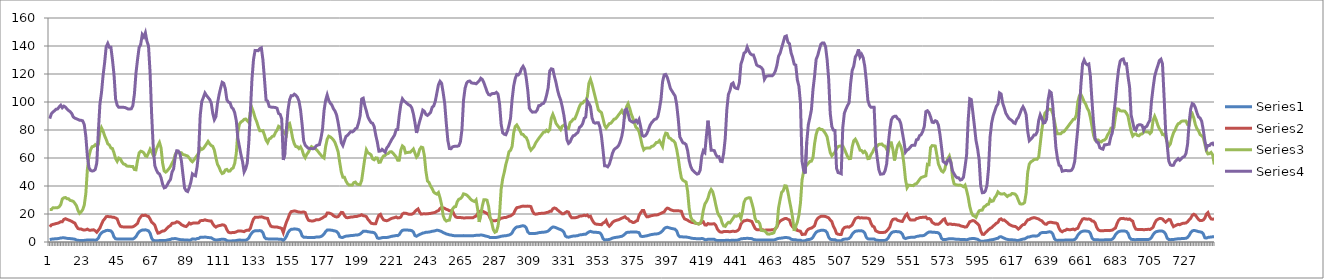
| Category | Series 0 | Series 1 | Series 2 | Series 3 |
|---|---|---|---|---|
| 0 | 1.62 | 10.87 | 23.15 | 88.1 |
| 1 | 2.01 | 12.18 | 23.14 | 91.56 |
| 2 | 2.13 | 12.58 | 24.39 | 92.85 |
| 3 | 2.24 | 12.83 | 24.37 | 93.68 |
| 4 | 2.37 | 13.2 | 24.41 | 94.81 |
| 5 | 2.41 | 13.39 | 24.51 | 95.03 |
| 6 | 2.59 | 13.84 | 25.14 | 96.51 |
| 7 | 2.88 | 14.51 | 26.75 | 97.7 |
| 8 | 2.96 | 14.46 | 30.78 | 95.88 |
| 9 | 3.01 | 16.14 | 31.55 | 97.03 |
| 10 | 2.82 | 16.63 | 31.79 | 96.36 |
| 11 | 2.6 | 16.16 | 30.94 | 94.97 |
| 12 | 2.51 | 15.7 | 30.88 | 93.92 |
| 13 | 2.42 | 15.26 | 29.72 | 93.07 |
| 14 | 2.32 | 14.76 | 29.45 | 91.81 |
| 15 | 2.17 | 14.03 | 29.03 | 89.3 |
| 16 | 2.01 | 13.48 | 27.63 | 88.48 |
| 17 | 1.4 | 11.31 | 25.93 | 88 |
| 18 | 1.2 | 9.6 | 22.55 | 87.52 |
| 19 | 1.12 | 9.28 | 20.48 | 86.98 |
| 20 | 1.12 | 9.26 | 21.52 | 86.93 |
| 21 | 1.12 | 8.74 | 23.09 | 86.53 |
| 22 | 1.15 | 8.52 | 26.3 | 83.9 |
| 23 | 1.26 | 8.72 | 34.6 | 75.58 |
| 24 | 1.45 | 9.19 | 51.88 | 61.16 |
| 25 | 1.38 | 8.49 | 61.28 | 53.19 |
| 26 | 1.37 | 8.37 | 65.73 | 51.13 |
| 27 | 1.4 | 8.63 | 68.06 | 50.7 |
| 28 | 1.39 | 8.69 | 68.34 | 50.93 |
| 29 | 1.29 | 8.01 | 69.52 | 51.77 |
| 30 | 1.58 | 6.97 | 68.59 | 56.44 |
| 31 | 2.76 | 8.42 | 69.94 | 78.97 |
| 32 | 5.15 | 10.01 | 78.29 | 98.62 |
| 33 | 6.52 | 12.69 | 81.59 | 106.73 |
| 34 | 7.29 | 15.15 | 79.28 | 118.89 |
| 35 | 7.7 | 16.5 | 75.8 | 128.14 |
| 36 | 8.24 | 18.07 | 73.26 | 139.55 |
| 37 | 8.33 | 18.29 | 70.12 | 141.83 |
| 38 | 8.17 | 17.98 | 69.31 | 139.04 |
| 39 | 7.92 | 18.02 | 67.14 | 139.03 |
| 40 | 6.64 | 17.7 | 66.78 | 130.13 |
| 41 | 3.52 | 17.64 | 63.54 | 119.34 |
| 42 | 2.31 | 17.12 | 59.59 | 102.07 |
| 43 | 2.14 | 16.54 | 57.61 | 97.72 |
| 44 | 2.13 | 13.36 | 59.98 | 96.23 |
| 45 | 2.13 | 11.3 | 59.4 | 96.23 |
| 46 | 2.13 | 10.83 | 57.24 | 96.23 |
| 47 | 2.13 | 10.79 | 55.75 | 96.19 |
| 48 | 2.13 | 10.77 | 55.45 | 96.06 |
| 49 | 2.13 | 10.76 | 54.35 | 95.55 |
| 50 | 2.13 | 10.76 | 54.12 | 94.95 |
| 51 | 2.13 | 10.7 | 54.08 | 94.97 |
| 52 | 2.11 | 10.68 | 53.93 | 95.17 |
| 53 | 2.15 | 10.86 | 53.92 | 97.37 |
| 54 | 2.73 | 11.47 | 51.78 | 105.73 |
| 55 | 3.83 | 12.32 | 51.59 | 120.67 |
| 56 | 5.85 | 13.29 | 58.27 | 130.42 |
| 57 | 7.32 | 16.34 | 63.59 | 138.94 |
| 58 | 8.02 | 17.89 | 64.83 | 141.09 |
| 59 | 8.54 | 19.11 | 64.52 | 148.12 |
| 60 | 8.57 | 18.95 | 63.67 | 146.43 |
| 61 | 8.71 | 19.18 | 61.49 | 149.46 |
| 62 | 8.37 | 18.56 | 61.16 | 143.45 |
| 63 | 7.97 | 18.23 | 63.61 | 139.99 |
| 64 | 6.3 | 16.45 | 66.29 | 120.93 |
| 65 | 2.75 | 14.19 | 64.42 | 91.11 |
| 66 | 1.06 | 13.3 | 61.85 | 68.34 |
| 67 | 0.97 | 12.06 | 62.26 | 54.69 |
| 68 | 0.98 | 8.77 | 66.19 | 51.45 |
| 69 | 0.91 | 6.32 | 68.87 | 49.29 |
| 70 | 1.04 | 6.55 | 71.08 | 48.61 |
| 71 | 1.07 | 7.29 | 67.27 | 45.91 |
| 72 | 0.99 | 7.86 | 56.3 | 41.29 |
| 73 | 1.03 | 7.94 | 50.75 | 38.7 |
| 74 | 1.12 | 8.82 | 49.92 | 39.12 |
| 75 | 1.42 | 10.11 | 50.99 | 40.93 |
| 76 | 1.67 | 11.09 | 52.28 | 43.09 |
| 77 | 1.83 | 11.76 | 53.94 | 44.6 |
| 78 | 2.36 | 13.31 | 56.14 | 49.9 |
| 79 | 2.37 | 13.46 | 58.34 | 52.12 |
| 80 | 2.47 | 13.65 | 62.37 | 60.45 |
| 81 | 2.27 | 14.45 | 64.44 | 65.17 |
| 82 | 1.97 | 14.21 | 63.69 | 65.02 |
| 83 | 1.76 | 13.45 | 63.66 | 63.26 |
| 84 | 1.6 | 12.37 | 63.71 | 57.77 |
| 85 | 1.54 | 11.8 | 62.46 | 47.99 |
| 86 | 1.48 | 11.31 | 62.2 | 38.56 |
| 87 | 1.41 | 11.03 | 61.78 | 36.6 |
| 88 | 1.45 | 12.03 | 61.36 | 36.05 |
| 89 | 1.19 | 13.57 | 59.99 | 38.82 |
| 90 | 1.51 | 12.86 | 58.38 | 42.69 |
| 91 | 2.22 | 13.38 | 57.3 | 48.66 |
| 92 | 2.11 | 13.64 | 58.63 | 47.75 |
| 93 | 2 | 13.59 | 60.24 | 47.26 |
| 94 | 2.45 | 13.54 | 61.86 | 53.65 |
| 95 | 2.53 | 13.7 | 63.48 | 64.28 |
| 96 | 3.35 | 15.14 | 67.16 | 90.67 |
| 97 | 3.34 | 15.36 | 66.12 | 100.39 |
| 98 | 3.31 | 15.43 | 66.8 | 103.18 |
| 99 | 3.58 | 15.87 | 68.4 | 106.42 |
| 100 | 3.36 | 15.46 | 70.05 | 104.69 |
| 101 | 3.2 | 15.25 | 71.83 | 103.28 |
| 102 | 3.1 | 15.05 | 70.11 | 101.82 |
| 103 | 3.03 | 15.04 | 68.92 | 99.48 |
| 104 | 2.29 | 12.93 | 68.32 | 91.83 |
| 105 | 1.69 | 11.44 | 65.64 | 87.4 |
| 106 | 1.42 | 10.64 | 60.15 | 89.59 |
| 107 | 1.49 | 11.37 | 55.51 | 98.94 |
| 108 | 1.67 | 11.69 | 53.45 | 105.05 |
| 109 | 1.85 | 11.89 | 50.62 | 109.94 |
| 110 | 1.97 | 12.27 | 48.91 | 114.07 |
| 111 | 1.95 | 12.16 | 49.38 | 113.39 |
| 112 | 1.73 | 11.4 | 51.47 | 109.49 |
| 113 | 0.92 | 8.76 | 51.83 | 101.61 |
| 114 | 0.77 | 6.98 | 50.55 | 99.95 |
| 115 | 0.79 | 6.65 | 50.73 | 99.49 |
| 116 | 0.8 | 6.67 | 52.24 | 96.17 |
| 117 | 0.82 | 6.78 | 52.9 | 95.16 |
| 118 | 0.85 | 6.86 | 56.14 | 92.33 |
| 119 | 1.06 | 7.25 | 63.37 | 86.74 |
| 120 | 1.28 | 7.78 | 78.37 | 74.2 |
| 121 | 1.41 | 7.91 | 84.15 | 68.17 |
| 122 | 1.32 | 7.83 | 85.75 | 62.28 |
| 123 | 1.28 | 7.67 | 86.41 | 57.35 |
| 124 | 1.21 | 7.39 | 87.62 | 50.05 |
| 125 | 1.29 | 8.12 | 87.85 | 52.39 |
| 126 | 1.78 | 8.47 | 86.66 | 56.38 |
| 127 | 2.81 | 8.34 | 85.4 | 71.38 |
| 128 | 5.03 | 9.79 | 93.07 | 93.12 |
| 129 | 6.59 | 13.47 | 95.68 | 116.04 |
| 130 | 7.6 | 16.47 | 92.68 | 130.44 |
| 131 | 8 | 17.67 | 88.72 | 136.83 |
| 132 | 8.12 | 17.7 | 86.04 | 136.76 |
| 133 | 8.11 | 17.68 | 82.4 | 136.65 |
| 134 | 8.13 | 17.86 | 79.41 | 138.08 |
| 135 | 7.9 | 17.97 | 79.45 | 138.65 |
| 136 | 6.64 | 17.7 | 79.56 | 130.13 |
| 137 | 3.39 | 17.22 | 76.32 | 116.26 |
| 138 | 2.29 | 17.04 | 72.73 | 101.49 |
| 139 | 2.24 | 16.83 | 70.98 | 100.63 |
| 140 | 2.15 | 13.44 | 73.63 | 96.81 |
| 141 | 2.14 | 11.32 | 74.14 | 96.42 |
| 142 | 2.13 | 10.83 | 75.47 | 96.23 |
| 143 | 2.13 | 10.79 | 75.7 | 96.19 |
| 144 | 2.13 | 10.77 | 78.2 | 96.06 |
| 145 | 2.13 | 10.76 | 79.88 | 95.55 |
| 146 | 2.02 | 10.32 | 82.67 | 91.77 |
| 147 | 2.01 | 10.17 | 82 | 91.18 |
| 148 | 1.89 | 9.67 | 80.55 | 87.9 |
| 149 | 1.04 | 6.75 | 79.03 | 58.63 |
| 150 | 2.26 | 10.81 | 77.51 | 62.82 |
| 151 | 4.07 | 14.29 | 76.3 | 80.99 |
| 152 | 6.65 | 16.73 | 84.07 | 94.34 |
| 153 | 8.2 | 19.84 | 84.74 | 101.51 |
| 154 | 9.03 | 21.68 | 79.92 | 104.51 |
| 155 | 9.14 | 21.92 | 73.92 | 104.44 |
| 156 | 9.38 | 22.22 | 70.18 | 105.59 |
| 157 | 9.27 | 22.01 | 68.14 | 104.83 |
| 158 | 9.09 | 21.65 | 68.05 | 103.43 |
| 159 | 8.7 | 21.38 | 66.75 | 100.69 |
| 160 | 7.53 | 21.3 | 67.94 | 94.41 |
| 161 | 4.42 | 21.3 | 65.74 | 84.01 |
| 162 | 3.44 | 21.49 | 62.11 | 72.16 |
| 163 | 3.31 | 21.04 | 60.22 | 69.17 |
| 164 | 3.31 | 17.9 | 62.61 | 67.93 |
| 165 | 3.19 | 15.63 | 64.13 | 66.98 |
| 166 | 3.17 | 15.13 | 66.59 | 66.81 |
| 167 | 3.16 | 15.07 | 68.13 | 66.72 |
| 168 | 3.16 | 15.05 | 67.42 | 66.58 |
| 169 | 3.28 | 15.32 | 67.3 | 67.02 |
| 170 | 3.54 | 15.91 | 66.13 | 68.72 |
| 171 | 3.6 | 15.96 | 64.89 | 69.22 |
| 172 | 3.6 | 15.98 | 63.42 | 69.55 |
| 173 | 3.9 | 16.66 | 62.1 | 73.98 |
| 174 | 4.54 | 17.18 | 60.77 | 80.26 |
| 175 | 5.68 | 18.02 | 59.95 | 93.89 |
| 176 | 7.45 | 18.46 | 68.06 | 101.18 |
| 177 | 8.6 | 20.69 | 73.37 | 105.07 |
| 178 | 8.63 | 20.77 | 75.59 | 101.18 |
| 179 | 8.49 | 20.34 | 75.04 | 99.15 |
| 180 | 8.44 | 19.89 | 74.14 | 97.86 |
| 181 | 8.09 | 18.82 | 72.86 | 95.17 |
| 182 | 7.88 | 18.2 | 71.01 | 93.51 |
| 183 | 7.49 | 17.86 | 67.93 | 90.7 |
| 184 | 6.41 | 18.13 | 64.34 | 85.25 |
| 185 | 3.74 | 19.52 | 56.87 | 78.45 |
| 186 | 3.3 | 21.15 | 50 | 70.97 |
| 187 | 3.28 | 20.98 | 46.3 | 68.93 |
| 188 | 3.81 | 18.91 | 46.26 | 72.27 |
| 189 | 4.18 | 17.6 | 43.53 | 75.44 |
| 190 | 4.27 | 17.32 | 41.63 | 76.18 |
| 191 | 4.42 | 17.54 | 40.65 | 77.51 |
| 192 | 4.59 | 17.79 | 40.69 | 78.83 |
| 193 | 4.63 | 17.83 | 40.72 | 78.63 |
| 194 | 4.78 | 18.06 | 42.42 | 79.37 |
| 195 | 4.95 | 18.25 | 42.79 | 80.9 |
| 196 | 4.97 | 18.29 | 41.34 | 81.43 |
| 197 | 5.17 | 18.68 | 41.07 | 85.01 |
| 198 | 5.66 | 18.9 | 40.98 | 90 |
| 199 | 6.61 | 19.48 | 44.01 | 102.12 |
| 200 | 7.63 | 18.78 | 51.74 | 102.71 |
| 201 | 7.69 | 18.61 | 59.63 | 97.41 |
| 202 | 7.71 | 18.13 | 65.81 | 93.62 |
| 203 | 7.33 | 16.2 | 63.66 | 89.27 |
| 204 | 7.21 | 14.91 | 63.15 | 87.1 |
| 205 | 7.01 | 13.44 | 62.26 | 85.3 |
| 206 | 6.91 | 13.14 | 59.33 | 84.81 |
| 207 | 6.59 | 13.04 | 58.74 | 82.4 |
| 208 | 5.43 | 13.1 | 60.09 | 76.27 |
| 209 | 2.9 | 16.5 | 59.93 | 71.31 |
| 210 | 2.55 | 19.14 | 56.88 | 64.88 |
| 211 | 2.78 | 19.77 | 57.08 | 64.93 |
| 212 | 3.09 | 17.4 | 59.85 | 66.16 |
| 213 | 3.27 | 15.8 | 61.49 | 65.15 |
| 214 | 3.25 | 15.39 | 61.82 | 64.15 |
| 215 | 3.22 | 15.21 | 62.95 | 67.19 |
| 216 | 3.4 | 15.6 | 63.18 | 68.55 |
| 217 | 3.7 | 16.23 | 64.32 | 70.69 |
| 218 | 4.02 | 16.84 | 64.48 | 72.86 |
| 219 | 4.23 | 17.14 | 63.5 | 74.63 |
| 220 | 4.4 | 17.42 | 62.1 | 76.41 |
| 221 | 4.61 | 17.87 | 60.78 | 80.14 |
| 222 | 4.55 | 17.19 | 58.41 | 80.33 |
| 223 | 5.28 | 17.3 | 58.46 | 90.49 |
| 224 | 7.12 | 17.8 | 65.72 | 98.24 |
| 225 | 8.29 | 20.04 | 68.62 | 102.26 |
| 226 | 8.57 | 20.63 | 67.68 | 100.71 |
| 227 | 8.59 | 20.6 | 63.62 | 99.95 |
| 228 | 8.57 | 20.25 | 63.93 | 98.92 |
| 229 | 8.43 | 19.88 | 64.04 | 97.98 |
| 230 | 8.35 | 19.75 | 64.04 | 97.46 |
| 231 | 8.1 | 19.84 | 65.18 | 95.79 |
| 232 | 7.17 | 20.44 | 66.4 | 91.55 |
| 233 | 4.59 | 21.67 | 63.48 | 85.34 |
| 234 | 4.11 | 22.8 | 60.62 | 77.91 |
| 235 | 4.78 | 23.63 | 62 | 81.94 |
| 236 | 5.4 | 21.29 | 66.12 | 86.12 |
| 237 | 5.84 | 19.92 | 67.79 | 89.93 |
| 238 | 6.39 | 20.08 | 67.39 | 94.19 |
| 239 | 6.55 | 20.14 | 61.84 | 93.39 |
| 240 | 6.98 | 20.07 | 50.46 | 91.12 |
| 241 | 6.99 | 20.14 | 43.6 | 90.43 |
| 242 | 7.11 | 20.3 | 42.48 | 91.36 |
| 243 | 7.32 | 20.42 | 39.9 | 92.56 |
| 244 | 7.7 | 20.73 | 38.11 | 96.26 |
| 245 | 7.79 | 20.91 | 35.65 | 97.2 |
| 246 | 8.05 | 21.21 | 34.74 | 100.64 |
| 247 | 8.46 | 22 | 34.17 | 106.48 |
| 248 | 8.27 | 22.37 | 35.33 | 112.36 |
| 249 | 7.88 | 23.87 | 31.6 | 114.77 |
| 250 | 7.47 | 24.74 | 26.66 | 113.41 |
| 251 | 6.74 | 24.41 | 18.82 | 106.74 |
| 252 | 6.29 | 24 | 16.07 | 98.92 |
| 253 | 5.73 | 23.35 | 14.96 | 84.79 |
| 254 | 5.48 | 22.98 | 15.45 | 72.55 |
| 255 | 5.09 | 22.32 | 15.62 | 66.78 |
| 256 | 5.03 | 22.33 | 19.87 | 66.6 |
| 257 | 4.63 | 22.12 | 23.54 | 67.96 |
| 258 | 4.54 | 19.58 | 25.02 | 68.29 |
| 259 | 4.54 | 17.92 | 25.3 | 68.37 |
| 260 | 4.54 | 17.52 | 28.77 | 68.37 |
| 261 | 4.54 | 17.52 | 30.54 | 68.79 |
| 262 | 4.54 | 17.51 | 30.94 | 71.5 |
| 263 | 4.4 | 17.29 | 32.06 | 80.27 |
| 264 | 4.57 | 17.21 | 34.39 | 101.26 |
| 265 | 4.43 | 17.18 | 34.08 | 109.85 |
| 266 | 4.5 | 17.38 | 33.54 | 113.59 |
| 267 | 4.53 | 17.37 | 32.57 | 114.75 |
| 268 | 4.53 | 17.36 | 31.29 | 115 |
| 269 | 4.39 | 17.27 | 30.08 | 113.7 |
| 270 | 4.43 | 17.37 | 29.39 | 113.45 |
| 271 | 4.62 | 17.96 | 28.91 | 113.37 |
| 272 | 4.77 | 18.54 | 30.09 | 112.98 |
| 273 | 4.82 | 20.34 | 23.58 | 114.03 |
| 274 | 4.85 | 21.54 | 14.33 | 115.12 |
| 275 | 5 | 22.11 | 19.33 | 116.96 |
| 276 | 4.9 | 21.99 | 25.73 | 116.13 |
| 277 | 4.61 | 21.53 | 30.2 | 113.74 |
| 278 | 4.28 | 20.93 | 30.19 | 110.61 |
| 279 | 4.04 | 20.33 | 29.85 | 107.36 |
| 280 | 3.74 | 19.55 | 25.4 | 105.28 |
| 281 | 3.14 | 16.95 | 17.29 | 104.93 |
| 282 | 3.14 | 15.47 | 13.77 | 105.88 |
| 283 | 3.15 | 15.1 | 8.84 | 106.09 |
| 284 | 3.16 | 15.11 | 6.95 | 106.16 |
| 285 | 3.29 | 15.38 | 7.5 | 106.88 |
| 286 | 3.48 | 15.73 | 11.44 | 105.62 |
| 287 | 3.75 | 16.22 | 20.15 | 98.76 |
| 288 | 4.11 | 16.99 | 37.76 | 84.15 |
| 289 | 4.24 | 17.2 | 45.23 | 77.97 |
| 290 | 4.41 | 17.49 | 49.79 | 77.01 |
| 291 | 4.45 | 17.49 | 55.41 | 76.62 |
| 292 | 4.73 | 17.93 | 59.41 | 79.27 |
| 293 | 4.96 | 18.4 | 64.48 | 83.22 |
| 294 | 5.47 | 18.64 | 65.46 | 88.36 |
| 295 | 6.57 | 19.43 | 68.28 | 101.79 |
| 296 | 8.62 | 20.31 | 77.96 | 111.35 |
| 297 | 9.95 | 22.83 | 82.57 | 116.79 |
| 298 | 10.77 | 24.51 | 83.6 | 119.69 |
| 299 | 10.85 | 24.78 | 81.72 | 119.35 |
| 300 | 11.11 | 25.02 | 79.5 | 120.73 |
| 301 | 11.44 | 25.44 | 77.04 | 123.79 |
| 302 | 11.61 | 25.65 | 76.81 | 125.49 |
| 303 | 11.3 | 25.5 | 75.37 | 123.43 |
| 304 | 10.15 | 25.46 | 74.59 | 117.3 |
| 305 | 7.2 | 25.63 | 72.2 | 108.32 |
| 306 | 6.12 | 25.58 | 67.6 | 95.55 |
| 307 | 6.12 | 25.26 | 65.57 | 93.78 |
| 308 | 6.15 | 22.13 | 66.85 | 92.75 |
| 309 | 6.16 | 20.25 | 68.19 | 92.85 |
| 310 | 6.16 | 19.87 | 70.72 | 92.85 |
| 311 | 6.32 | 19.99 | 72.39 | 94.27 |
| 312 | 6.68 | 20.33 | 73.96 | 97.39 |
| 313 | 6.75 | 20.39 | 75.45 | 97.54 |
| 314 | 6.93 | 20.57 | 76.9 | 98.67 |
| 315 | 6.97 | 20.54 | 78.42 | 98.98 |
| 316 | 7.13 | 20.69 | 78.58 | 100.83 |
| 317 | 7.37 | 21.05 | 79.86 | 104.9 |
| 318 | 7.87 | 21.26 | 78.87 | 110.13 |
| 319 | 8.81 | 21.89 | 80.19 | 122.16 |
| 320 | 10 | 21.93 | 88.36 | 123.71 |
| 321 | 10.69 | 23.74 | 91.22 | 123.35 |
| 322 | 10.61 | 24.3 | 88.4 | 118.28 |
| 323 | 10.24 | 23.91 | 84.77 | 114 |
| 324 | 9.71 | 22.87 | 83.17 | 108.51 |
| 325 | 9.22 | 21.89 | 81.82 | 104.39 |
| 326 | 8.84 | 21.06 | 80.31 | 101.43 |
| 327 | 8.19 | 20.1 | 82.75 | 96.58 |
| 328 | 7.08 | 20.2 | 83.36 | 90.81 |
| 329 | 4.33 | 21.07 | 82.72 | 83.24 |
| 330 | 3.54 | 21.7 | 81.07 | 72.99 |
| 331 | 3.45 | 21.35 | 81.01 | 70.42 |
| 332 | 3.71 | 18.73 | 85.38 | 71.43 |
| 333 | 4.03 | 17.33 | 86.24 | 74.13 |
| 334 | 4.23 | 17.27 | 87.73 | 75.89 |
| 335 | 4.28 | 17.3 | 87.98 | 76.23 |
| 336 | 4.42 | 17.52 | 90.63 | 77.37 |
| 337 | 4.59 | 17.78 | 93.7 | 78.32 |
| 338 | 5.06 | 18.47 | 96.92 | 81.86 |
| 339 | 5.16 | 18.54 | 98.92 | 82.7 |
| 340 | 5.32 | 18.76 | 99.18 | 84.47 |
| 341 | 5.54 | 19.16 | 100.59 | 88.28 |
| 342 | 5.58 | 18.79 | 100.83 | 89.34 |
| 343 | 6.46 | 19.26 | 103.71 | 100.73 |
| 344 | 7.2 | 17.97 | 113.41 | 99 |
| 345 | 7.62 | 18.42 | 116.15 | 96.84 |
| 346 | 7.2 | 15.86 | 112.67 | 88.63 |
| 347 | 6.99 | 14.06 | 108.16 | 85.48 |
| 348 | 6.93 | 12.99 | 103.68 | 84.84 |
| 349 | 6.87 | 12.67 | 99.18 | 85.21 |
| 350 | 6.81 | 12.59 | 94.49 | 85.25 |
| 351 | 6.49 | 12.56 | 93.35 | 82.27 |
| 352 | 5.29 | 12.33 | 92.46 | 75.74 |
| 353 | 2.41 | 13.51 | 88.13 | 65.69 |
| 354 | 1.41 | 14.06 | 83.41 | 54.47 |
| 355 | 1.59 | 15.43 | 81.47 | 54.4 |
| 356 | 1.66 | 12.59 | 82.97 | 53.72 |
| 357 | 1.84 | 11.29 | 84.52 | 55.48 |
| 358 | 2.22 | 12.38 | 84.83 | 59.05 |
| 359 | 2.74 | 13.95 | 86.17 | 63.27 |
| 360 | 3.08 | 14.83 | 87.69 | 65.88 |
| 361 | 3.27 | 15.28 | 88.02 | 66.9 |
| 362 | 3.42 | 15.64 | 89.33 | 67.65 |
| 363 | 3.58 | 15.92 | 90.87 | 69.01 |
| 364 | 3.85 | 16.47 | 92.32 | 71.71 |
| 365 | 4.08 | 17 | 93.94 | 75.56 |
| 366 | 4.72 | 17.49 | 91.67 | 81.81 |
| 367 | 5.71 | 18.08 | 90.18 | 94.19 |
| 368 | 6.72 | 16.89 | 96.48 | 94.87 |
| 369 | 7.01 | 16.54 | 98.79 | 91.78 |
| 370 | 7.04 | 14.98 | 95.61 | 87.02 |
| 371 | 7.1 | 14.67 | 91.53 | 86.18 |
| 372 | 7.1 | 13.95 | 88.67 | 85.52 |
| 373 | 7.1 | 14.02 | 85 | 85.75 |
| 374 | 7.2 | 14.89 | 81.98 | 86.93 |
| 375 | 6.95 | 15.27 | 81 | 85.45 |
| 376 | 6.68 | 19.04 | 78.84 | 87.54 |
| 377 | 4.23 | 20.85 | 74.09 | 82.48 |
| 378 | 3.91 | 22.44 | 69.05 | 76.2 |
| 379 | 4.04 | 22.47 | 65.83 | 75.5 |
| 380 | 4.24 | 19.65 | 66.92 | 75.96 |
| 381 | 4.42 | 17.98 | 67.12 | 77.46 |
| 382 | 4.74 | 18.06 | 67.19 | 80.25 |
| 383 | 5.09 | 18.53 | 67.2 | 83.34 |
| 384 | 5.32 | 18.82 | 68.29 | 85.19 |
| 385 | 5.52 | 19.06 | 68.51 | 86.46 |
| 386 | 5.71 | 19.3 | 69.65 | 87.59 |
| 387 | 5.75 | 19.29 | 71.04 | 87.95 |
| 388 | 5.9 | 19.47 | 71.18 | 89.64 |
| 389 | 6.29 | 20.01 | 72.41 | 94.99 |
| 390 | 6.98 | 20.43 | 70.3 | 101.91 |
| 391 | 7.97 | 21.09 | 68.15 | 114.34 |
| 392 | 9.51 | 21.43 | 74.81 | 119.33 |
| 393 | 10.28 | 23.25 | 77.77 | 119.72 |
| 394 | 10.54 | 24.2 | 77.49 | 117.63 |
| 395 | 10.22 | 23.89 | 74.42 | 113.85 |
| 396 | 9.85 | 23.11 | 74.01 | 109.66 |
| 397 | 9.61 | 22.71 | 72.78 | 107.84 |
| 398 | 9.39 | 22.31 | 72.31 | 106.02 |
| 399 | 9.13 | 22.29 | 70.8 | 104.34 |
| 400 | 7.98 | 22.27 | 66.23 | 98.26 |
| 401 | 4.88 | 22.27 | 59.93 | 87.93 |
| 402 | 3.78 | 22.19 | 51.99 | 75.09 |
| 403 | 3.75 | 21.95 | 45.76 | 73.01 |
| 404 | 3.64 | 18.59 | 44.06 | 70.81 |
| 405 | 3.62 | 16.57 | 43.44 | 70.53 |
| 406 | 3.58 | 16.07 | 42.83 | 69.57 |
| 407 | 3.35 | 15.59 | 36.1 | 65.17 |
| 408 | 3.21 | 14.82 | 23.85 | 57.98 |
| 409 | 2.84 | 14.33 | 17.77 | 53.81 |
| 410 | 2.6 | 13.93 | 15.45 | 51.46 |
| 411 | 2.56 | 13.79 | 15.07 | 50.4 |
| 412 | 2.43 | 13.45 | 13.45 | 49.37 |
| 413 | 2.31 | 13.21 | 13.3 | 48.49 |
| 414 | 2.24 | 12.96 | 12.73 | 48.89 |
| 415 | 2.3 | 13.17 | 13.31 | 51.34 |
| 416 | 2.57 | 13.96 | 15.82 | 61.27 |
| 417 | 2.28 | 14.48 | 22.68 | 65.22 |
| 418 | 1.64 | 12.21 | 27.15 | 63.96 |
| 419 | 1.62 | 12.07 | 28.92 | 76.07 |
| 420 | 2.02 | 13.19 | 31.33 | 86.64 |
| 421 | 2 | 12.81 | 35.46 | 76.7 |
| 422 | 2 | 12.77 | 37.52 | 65.57 |
| 423 | 2.03 | 12.94 | 35.89 | 65.52 |
| 424 | 1.91 | 13.06 | 31.69 | 65.28 |
| 425 | 1.2 | 11.82 | 26.38 | 62.42 |
| 426 | 1.12 | 9.17 | 21.46 | 60.73 |
| 427 | 1.12 | 7.74 | 18.87 | 60.94 |
| 428 | 1.04 | 7.07 | 17.43 | 57.64 |
| 429 | 1.02 | 7.04 | 13.6 | 57.4 |
| 430 | 1.12 | 7.43 | 11.49 | 63.42 |
| 431 | 1.15 | 7.49 | 11.15 | 74.13 |
| 432 | 1.27 | 7.45 | 12.85 | 94.41 |
| 433 | 1.19 | 7.43 | 14.02 | 105.35 |
| 434 | 1.12 | 7.32 | 13.67 | 108.23 |
| 435 | 1.2 | 7.54 | 15.3 | 112.81 |
| 436 | 1.21 | 7.7 | 16.95 | 113.61 |
| 437 | 1.15 | 7.52 | 18.71 | 110.39 |
| 438 | 1.21 | 7.64 | 18.34 | 109.74 |
| 439 | 1.4 | 8.25 | 18.73 | 109.53 |
| 440 | 1.76 | 9.45 | 19.73 | 113.86 |
| 441 | 2.24 | 12.75 | 16.91 | 127.06 |
| 442 | 2.36 | 14.27 | 21.75 | 130.49 |
| 443 | 2.5 | 15.16 | 28.44 | 134.95 |
| 444 | 2.54 | 15.29 | 30.72 | 135.72 |
| 445 | 2.65 | 15.66 | 31.26 | 139.2 |
| 446 | 2.57 | 15.37 | 31.65 | 136.43 |
| 447 | 2.51 | 15.08 | 31.51 | 134.5 |
| 448 | 2.37 | 14.61 | 27.76 | 133.68 |
| 449 | 1.8 | 12.06 | 23.47 | 133.6 |
| 450 | 1.57 | 9.84 | 16.97 | 130.38 |
| 451 | 1.45 | 8.83 | 14.67 | 126.52 |
| 452 | 1.43 | 8.71 | 14.68 | 125.7 |
| 453 | 1.42 | 8.69 | 13.19 | 125.37 |
| 454 | 1.42 | 8.69 | 8.31 | 124.57 |
| 455 | 1.42 | 8.69 | 8.09 | 123.13 |
| 456 | 1.34 | 8.3 | 8.02 | 116.27 |
| 457 | 1.4 | 8.6 | 6.9 | 118.22 |
| 458 | 1.41 | 8.65 | 5.69 | 118.58 |
| 459 | 1.42 | 8.63 | 5.61 | 118.79 |
| 460 | 1.41 | 8.61 | 5.92 | 118.79 |
| 461 | 1.42 | 8.73 | 6.1 | 118.79 |
| 462 | 1.48 | 8.87 | 6.56 | 119.92 |
| 463 | 1.73 | 9.48 | 9.58 | 122.19 |
| 464 | 2.22 | 10.8 | 11.43 | 126.35 |
| 465 | 2.57 | 13.51 | 24.18 | 132.69 |
| 466 | 2.66 | 14.87 | 30.17 | 134.86 |
| 467 | 2.81 | 15.68 | 35.53 | 138.81 |
| 468 | 2.98 | 16.21 | 36.58 | 142.64 |
| 469 | 3.16 | 16.71 | 40.17 | 146.67 |
| 470 | 3.2 | 16.77 | 39.97 | 147.16 |
| 471 | 3.02 | 16.18 | 35.54 | 142.76 |
| 472 | 2.85 | 15.65 | 29.49 | 141.56 |
| 473 | 2.02 | 12.27 | 23.8 | 135.15 |
| 474 | 1.74 | 10.73 | 17.28 | 131.69 |
| 475 | 1.57 | 9.99 | 7.88 | 127.01 |
| 476 | 1.55 | 9.91 | 11.26 | 126.4 |
| 477 | 1.28 | 8.24 | 14.14 | 115.81 |
| 478 | 1.27 | 7.96 | 19.16 | 111.27 |
| 479 | 1.29 | 7.68 | 27.84 | 98.85 |
| 480 | 0.72 | 5.37 | 44.31 | 57.64 |
| 481 | 0.81 | 5.48 | 50.35 | 51.15 |
| 482 | 0.83 | 5.49 | 53.06 | 48.91 |
| 483 | 1.51 | 7.93 | 54.96 | 71.35 |
| 484 | 1.78 | 9.08 | 56.21 | 83.73 |
| 485 | 1.89 | 9.67 | 57.51 | 88.86 |
| 486 | 2.36 | 9.91 | 57.76 | 94.55 |
| 487 | 3.44 | 10.68 | 60.4 | 108.98 |
| 488 | 5.45 | 11.64 | 70.16 | 118.54 |
| 489 | 6.98 | 15.21 | 76.87 | 130.47 |
| 490 | 7.69 | 16.84 | 80.37 | 133.21 |
| 491 | 8.02 | 17.75 | 81.08 | 137.41 |
| 492 | 8.31 | 18.3 | 80.4 | 141.27 |
| 493 | 8.35 | 18.41 | 80.28 | 142.21 |
| 494 | 8.3 | 18.38 | 78.97 | 142.11 |
| 495 | 7.95 | 18.18 | 77.34 | 139.61 |
| 496 | 6.64 | 17.72 | 75.04 | 130.32 |
| 497 | 3.39 | 17.22 | 69.17 | 116.26 |
| 498 | 1.99 | 15.73 | 63.87 | 91.76 |
| 499 | 1.71 | 14.65 | 61.6 | 82.49 |
| 500 | 1.68 | 11.27 | 62.88 | 79.9 |
| 501 | 1.68 | 9.19 | 64.2 | 79.69 |
| 502 | 0.95 | 6.08 | 66.59 | 52.76 |
| 503 | 0.87 | 5.56 | 68.13 | 49.55 |
| 504 | 0.84 | 5.38 | 68.49 | 49.28 |
| 505 | 0.84 | 5.37 | 68.57 | 48.77 |
| 506 | 1.75 | 8.94 | 68.54 | 81.83 |
| 507 | 2.03 | 10.29 | 66.42 | 91.99 |
| 508 | 2.11 | 10.66 | 63.75 | 94.98 |
| 509 | 2.15 | 10.86 | 61.11 | 97.37 |
| 510 | 2.51 | 10.59 | 59.53 | 99.46 |
| 511 | 3.56 | 11.28 | 59.69 | 113.26 |
| 512 | 5.57 | 12.21 | 67.99 | 122.61 |
| 513 | 6.81 | 14.58 | 72.36 | 125.56 |
| 514 | 7.66 | 16.71 | 73.46 | 132.24 |
| 515 | 7.89 | 17.28 | 71.39 | 133.94 |
| 516 | 7.98 | 17.68 | 68.65 | 137.62 |
| 517 | 7.94 | 17.12 | 65.58 | 132.17 |
| 518 | 7.97 | 17.31 | 65.33 | 134.04 |
| 519 | 7.62 | 17.13 | 63.86 | 131.73 |
| 520 | 6.46 | 17.1 | 64.78 | 125.7 |
| 521 | 3.36 | 17.09 | 63.23 | 115.3 |
| 522 | 2.28 | 17.01 | 59.53 | 101.29 |
| 523 | 2.13 | 16.52 | 59.7 | 97.52 |
| 524 | 2.13 | 13.36 | 62.48 | 96.23 |
| 525 | 2.13 | 11.3 | 64.13 | 96.23 |
| 526 | 2.13 | 10.83 | 66.59 | 96.23 |
| 527 | 1.45 | 7.96 | 68.13 | 69.13 |
| 528 | 1.2 | 7.47 | 68.49 | 59.87 |
| 529 | 1.14 | 6.92 | 69.69 | 51.69 |
| 530 | 1.13 | 6.79 | 69.87 | 48.45 |
| 531 | 1.14 | 6.82 | 69.96 | 48.52 |
| 532 | 1.14 | 6.87 | 68.67 | 48.77 |
| 533 | 1.16 | 6.99 | 68.47 | 50.95 |
| 534 | 1.73 | 7.86 | 66.26 | 55.79 |
| 535 | 2.88 | 9.13 | 64.19 | 69.61 |
| 536 | 5.01 | 10.74 | 70.93 | 80.14 |
| 537 | 6.5 | 14.46 | 70.92 | 87.3 |
| 538 | 7.21 | 16.11 | 65.93 | 89.21 |
| 539 | 7.38 | 16.45 | 58.25 | 89.76 |
| 540 | 7.49 | 16.41 | 64.38 | 89.78 |
| 541 | 7.33 | 15.44 | 68.91 | 88.1 |
| 542 | 7.24 | 15.15 | 70.6 | 87.39 |
| 543 | 6.86 | 14.83 | 68.26 | 84.7 |
| 544 | 5.66 | 14.66 | 64.1 | 78.3 |
| 545 | 2.97 | 16.8 | 55.88 | 71.9 |
| 546 | 2.46 | 18.88 | 44.74 | 64.18 |
| 547 | 2.87 | 20 | 38.76 | 65.67 |
| 548 | 3.11 | 17.43 | 40.6 | 66.28 |
| 549 | 3.28 | 15.82 | 40.46 | 67.64 |
| 550 | 3.43 | 15.71 | 40.4 | 68.92 |
| 551 | 3.46 | 15.74 | 40.26 | 69.16 |
| 552 | 3.46 | 15.74 | 41.33 | 69.09 |
| 553 | 3.98 | 16.75 | 41.61 | 73.02 |
| 554 | 4.08 | 16.93 | 43.05 | 73.29 |
| 555 | 4.39 | 17.4 | 44.68 | 75.98 |
| 556 | 4.42 | 17.46 | 46.03 | 76.64 |
| 557 | 4.48 | 17.66 | 46.43 | 78.99 |
| 558 | 4.8 | 17.62 | 46.83 | 82.48 |
| 559 | 5.59 | 17.87 | 47.26 | 93.15 |
| 560 | 6.58 | 16.55 | 55.52 | 93.75 |
| 561 | 7.08 | 16.8 | 55.21 | 92.41 |
| 562 | 7.23 | 16.21 | 67.35 | 89.41 |
| 563 | 7 | 14.07 | 68.85 | 85.57 |
| 564 | 7 | 13.36 | 68.81 | 85.3 |
| 565 | 6.87 | 12.68 | 68.58 | 86.62 |
| 566 | 6.85 | 12.78 | 62.23 | 86.12 |
| 567 | 6.52 | 12.72 | 55.75 | 83.55 |
| 568 | 5.5 | 13.46 | 53.08 | 76.91 |
| 569 | 2.58 | 14.57 | 50.72 | 67.67 |
| 570 | 1.75 | 15.97 | 50 | 57.65 |
| 571 | 1.8 | 16.51 | 51.63 | 56.63 |
| 572 | 1.84 | 13.56 | 56.72 | 55.78 |
| 573 | 2.13 | 12.55 | 59.52 | 58.17 |
| 574 | 2.36 | 12.9 | 61.42 | 59.46 |
| 575 | 2.31 | 12.88 | 57.29 | 56.63 |
| 576 | 2.32 | 12.47 | 46.14 | 50.81 |
| 577 | 2.21 | 12.65 | 41.57 | 48.73 |
| 578 | 2.03 | 12.34 | 40.87 | 46.84 |
| 579 | 2.01 | 12.23 | 40.77 | 45.9 |
| 580 | 1.99 | 12.19 | 40.58 | 45.8 |
| 581 | 1.79 | 11.63 | 40.68 | 44.28 |
| 582 | 1.72 | 11.28 | 40.15 | 44.65 |
| 583 | 1.7 | 11.04 | 39.51 | 46.28 |
| 584 | 1.73 | 10.63 | 40.64 | 53.66 |
| 585 | 1.57 | 10.82 | 36.84 | 62.09 |
| 586 | 1.93 | 12.47 | 32.04 | 86.89 |
| 587 | 2.29 | 14.51 | 25.47 | 102.26 |
| 588 | 2.4 | 14.89 | 21.32 | 101.69 |
| 589 | 2.51 | 15.32 | 19.02 | 92.55 |
| 590 | 2.43 | 15.03 | 18.49 | 82.79 |
| 591 | 2.19 | 13.9 | 17.63 | 72.53 |
| 592 | 1.94 | 13.1 | 20.29 | 66.78 |
| 593 | 1.2 | 11.75 | 22.29 | 58.75 |
| 594 | 0.54 | 7.78 | 22.72 | 40.11 |
| 595 | 0.5 | 5.51 | 22.76 | 35.25 |
| 596 | 0.57 | 5.42 | 25.1 | 35.28 |
| 597 | 0.78 | 6.64 | 25.62 | 36.45 |
| 598 | 0.94 | 7.65 | 26.8 | 40.46 |
| 599 | 1.11 | 8.72 | 27 | 52.43 |
| 600 | 1.51 | 9.71 | 30.3 | 75.24 |
| 601 | 1.53 | 10.27 | 29.03 | 85.12 |
| 602 | 1.79 | 11.47 | 29.38 | 90.33 |
| 603 | 2.06 | 12.31 | 31.71 | 93.54 |
| 604 | 2.45 | 13.4 | 33.21 | 96.94 |
| 605 | 2.65 | 14.01 | 35.78 | 98.52 |
| 606 | 3.64 | 16.09 | 34.74 | 106.51 |
| 607 | 3.75 | 16.55 | 34.24 | 105.78 |
| 608 | 3.19 | 15.54 | 34.28 | 99.23 |
| 609 | 2.7 | 15.75 | 34.54 | 95.93 |
| 610 | 2.14 | 14.76 | 33.6 | 92.01 |
| 611 | 1.88 | 13.84 | 32.51 | 90.15 |
| 612 | 1.67 | 12.75 | 33.42 | 88.33 |
| 613 | 1.59 | 12.08 | 33.56 | 87.45 |
| 614 | 1.54 | 11.55 | 34.65 | 86.64 |
| 615 | 1.48 | 11.22 | 34.51 | 85.2 |
| 616 | 1.38 | 11.1 | 34.15 | 84.68 |
| 617 | 1.1 | 10.38 | 32.78 | 87.55 |
| 618 | 1.13 | 9.24 | 29.91 | 88.86 |
| 619 | 1.43 | 10.1 | 27.33 | 91.59 |
| 620 | 1.78 | 11.43 | 27.06 | 94.62 |
| 621 | 2.07 | 12.37 | 27.33 | 96.61 |
| 622 | 2.16 | 12.6 | 28.2 | 94.49 |
| 623 | 2.85 | 14.35 | 35 | 90.9 |
| 624 | 3.51 | 15.88 | 49.85 | 79.01 |
| 625 | 3.59 | 16 | 55.63 | 72.38 |
| 626 | 4.01 | 16.8 | 57.23 | 73.53 |
| 627 | 4.22 | 17.12 | 57.89 | 74.67 |
| 628 | 4.4 | 17.42 | 58.89 | 76.41 |
| 629 | 4.19 | 17.19 | 59.08 | 76.51 |
| 630 | 4.34 | 16.81 | 59.13 | 78.53 |
| 631 | 4.87 | 16.4 | 60.66 | 86.81 |
| 632 | 6.23 | 15.61 | 70.23 | 90.89 |
| 633 | 6.69 | 15.13 | 79.96 | 88.57 |
| 634 | 6.84 | 13.83 | 87.21 | 85.02 |
| 635 | 6.79 | 12.85 | 92.1 | 85.28 |
| 636 | 6.84 | 12.65 | 93.33 | 87.64 |
| 637 | 7.13 | 13.75 | 94.79 | 101.36 |
| 638 | 7.31 | 14.05 | 94.79 | 107.58 |
| 639 | 7.01 | 14.07 | 94.6 | 106.63 |
| 640 | 5.75 | 13.83 | 91.57 | 97.08 |
| 641 | 2.48 | 13.66 | 86.78 | 82.4 |
| 642 | 1.36 | 13.54 | 80.7 | 67.28 |
| 643 | 1.15 | 13.02 | 77.31 | 59.52 |
| 644 | 1.18 | 9.69 | 77.26 | 54.85 |
| 645 | 1.21 | 7.95 | 77.26 | 54.21 |
| 646 | 1.2 | 7.29 | 78.47 | 50.54 |
| 647 | 1.32 | 8.08 | 78.7 | 50.84 |
| 648 | 1.36 | 8.29 | 80.02 | 51.08 |
| 649 | 1.36 | 9.12 | 81.48 | 51.01 |
| 650 | 1.41 | 8.85 | 82.98 | 50.85 |
| 651 | 1.41 | 8.76 | 84.55 | 50.82 |
| 652 | 1.43 | 8.91 | 85.97 | 51.3 |
| 653 | 1.49 | 9.25 | 87.53 | 53.24 |
| 654 | 1.82 | 8.67 | 87.84 | 57.6 |
| 655 | 2.95 | 9.42 | 90.66 | 69.98 |
| 656 | 4.92 | 9.83 | 100.35 | 81.5 |
| 657 | 6.25 | 12.46 | 104.53 | 95.63 |
| 658 | 7.2 | 14.46 | 105.28 | 113.33 |
| 659 | 7.67 | 16.36 | 102.93 | 127.12 |
| 660 | 7.88 | 16.71 | 100.24 | 129.98 |
| 661 | 7.8 | 16.44 | 98.5 | 127.51 |
| 662 | 7.73 | 16.3 | 95.52 | 126.6 |
| 663 | 7.46 | 16.43 | 93.57 | 127.15 |
| 664 | 6.22 | 16.09 | 88.99 | 118.28 |
| 665 | 2.94 | 15.04 | 82.72 | 100.81 |
| 666 | 1.83 | 14.88 | 76.33 | 85.23 |
| 667 | 1.53 | 13.69 | 72.87 | 74.02 |
| 668 | 1.54 | 10.53 | 72.82 | 71.39 |
| 669 | 1.54 | 8.71 | 72.82 | 70.95 |
| 670 | 1.45 | 8.12 | 71.66 | 67.36 |
| 671 | 1.43 | 8.05 | 71.45 | 66.65 |
| 672 | 1.42 | 8.02 | 72.57 | 66.29 |
| 673 | 1.53 | 8.16 | 72.8 | 69.38 |
| 674 | 1.53 | 8.18 | 74.01 | 69.45 |
| 675 | 1.54 | 8.14 | 76.62 | 69.69 |
| 676 | 1.53 | 8.12 | 78.2 | 69.89 |
| 677 | 1.57 | 8.31 | 81.01 | 75.06 |
| 678 | 2.04 | 8.5 | 80.31 | 78.08 |
| 679 | 3.21 | 9.32 | 81.7 | 92.17 |
| 680 | 5.24 | 10 | 89.87 | 101.5 |
| 681 | 6.55 | 13.23 | 95.08 | 113.91 |
| 682 | 7.4 | 15.53 | 94.87 | 123.5 |
| 683 | 7.73 | 16.63 | 93.7 | 129.16 |
| 684 | 7.9 | 16.84 | 93.62 | 130.38 |
| 685 | 7.9 | 16.88 | 93.62 | 130.76 |
| 686 | 7.76 | 16.47 | 93.4 | 127.21 |
| 687 | 7.48 | 16.54 | 91.96 | 127.36 |
| 688 | 6.23 | 16.17 | 89.87 | 118.28 |
| 689 | 3.2 | 16.47 | 84.03 | 110.73 |
| 690 | 1.96 | 15.56 | 78.98 | 90.51 |
| 691 | 1.78 | 14.9 | 75.74 | 85.67 |
| 692 | 1.69 | 11.23 | 76.96 | 80.55 |
| 693 | 1.68 | 9.16 | 77.19 | 79.9 |
| 694 | 1.75 | 8.99 | 76.07 | 83.1 |
| 695 | 1.77 | 9.01 | 75.85 | 83.7 |
| 696 | 1.77 | 9.01 | 77 | 83.78 |
| 697 | 1.77 | 9 | 77.24 | 83.27 |
| 698 | 1.7 | 8.72 | 78.48 | 79.84 |
| 699 | 1.76 | 8.88 | 78.73 | 82.06 |
| 700 | 1.75 | 8.9 | 78.65 | 82.68 |
| 701 | 1.79 | 9.1 | 78.65 | 85.09 |
| 702 | 2.18 | 8.92 | 77.43 | 86.99 |
| 703 | 3.24 | 9.62 | 78.68 | 100.83 |
| 704 | 5.25 | 10.54 | 86.87 | 110.17 |
| 705 | 6.64 | 13.35 | 89.76 | 118.25 |
| 706 | 7.37 | 15.38 | 87.08 | 122.46 |
| 707 | 7.64 | 16.19 | 83.47 | 125.88 |
| 708 | 7.87 | 16.73 | 80.85 | 129.57 |
| 709 | 7.89 | 16.8 | 79.32 | 130.56 |
| 710 | 7.75 | 16.41 | 76.75 | 127.21 |
| 711 | 7.12 | 15.13 | 76.89 | 103.95 |
| 712 | 5.64 | 14.19 | 74.91 | 79.38 |
| 713 | 2.68 | 15.18 | 71.23 | 69.34 |
| 714 | 1.79 | 16.12 | 68.46 | 57.84 |
| 715 | 1.67 | 15.82 | 70.04 | 55.12 |
| 716 | 1.75 | 13.06 | 74.59 | 54.69 |
| 717 | 1.76 | 10.97 | 77.94 | 54.84 |
| 718 | 2.01 | 11.61 | 79.83 | 57.29 |
| 719 | 2.16 | 12.14 | 82.67 | 58.55 |
| 720 | 2.3 | 12.6 | 84.48 | 59.57 |
| 721 | 2.23 | 12.33 | 84.88 | 58.43 |
| 722 | 2.42 | 12.97 | 86.17 | 59.44 |
| 723 | 2.56 | 13.35 | 86.43 | 60.6 |
| 724 | 2.58 | 13.43 | 86.36 | 61.07 |
| 725 | 2.62 | 13.62 | 86.35 | 63.33 |
| 726 | 3.3 | 14.43 | 83.85 | 69.76 |
| 727 | 4.66 | 15.91 | 83.62 | 85.14 |
| 728 | 6.75 | 16.98 | 90.25 | 95.17 |
| 729 | 7.87 | 19.06 | 91.59 | 98.85 |
| 730 | 8.27 | 19.85 | 88.47 | 98.25 |
| 731 | 8.09 | 19.18 | 83.73 | 95.9 |
| 732 | 7.77 | 17.6 | 80.91 | 92.2 |
| 733 | 7.43 | 16.08 | 79.32 | 89.28 |
| 734 | 7.24 | 15.27 | 76.75 | 88.54 |
| 735 | 6.93 | 15.32 | 75.88 | 86.24 |
| 736 | 5.84 | 15.73 | 74.72 | 80.21 |
| 737 | 3.02 | 17.01 | 70.14 | 72.35 |
| 738 | 2.79 | 19.87 | 65.11 | 66.91 |
| 739 | 3.28 | 20.99 | 62.92 | 68.99 |
| 740 | 3.43 | 18.16 | 63.14 | 68.99 |
| 741 | 3.58 | 16.49 | 64 | 70.18 |
| 742 | 3.7 | 16.31 | 62.28 | 70.61 |
| 743 | 3.76 | 16.41 | 55.36 | 68.7 |